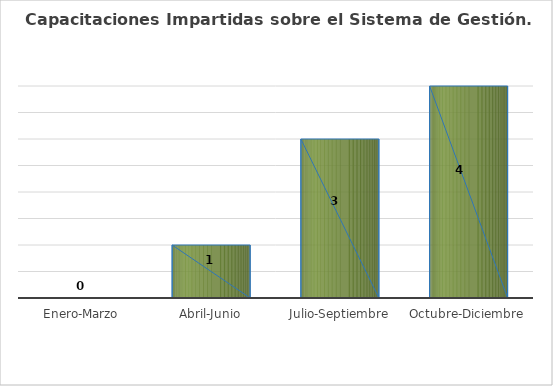
| Category | Capacitaciones Impartidas |
|---|---|
| Enero-Marzo | 0 |
| Abril-Junio | 1 |
| Julio-Septiembre | 3 |
| Octubre-Diciembre | 4 |